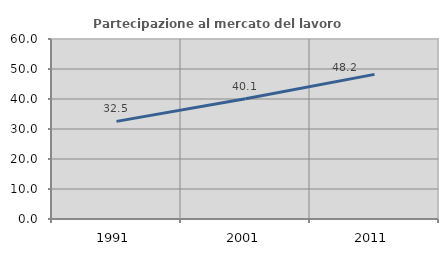
| Category | Partecipazione al mercato del lavoro  femminile |
|---|---|
| 1991.0 | 32.547 |
| 2001.0 | 40.102 |
| 2011.0 | 48.214 |